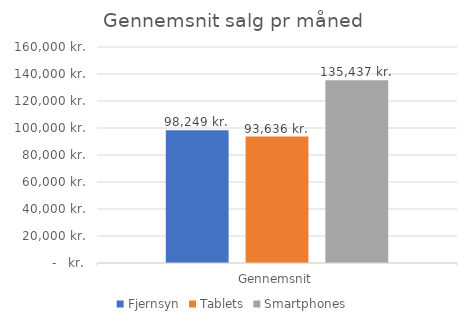
| Category | Fjernsyn | Tablets | Smartphones |
|---|---|---|---|
| Gennemsnit | 98248.856 | 93635.627 | 135436.974 |